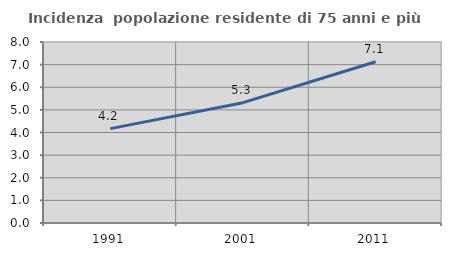
| Category | Incidenza  popolazione residente di 75 anni e più |
|---|---|
| 1991.0 | 4.171 |
| 2001.0 | 5.319 |
| 2011.0 | 7.125 |